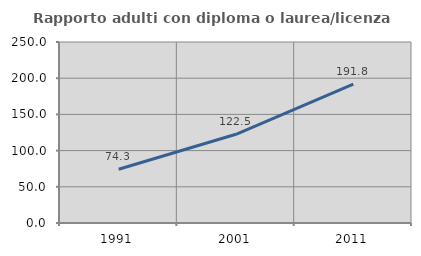
| Category | Rapporto adulti con diploma o laurea/licenza media  |
|---|---|
| 1991.0 | 74.302 |
| 2001.0 | 122.503 |
| 2011.0 | 191.757 |